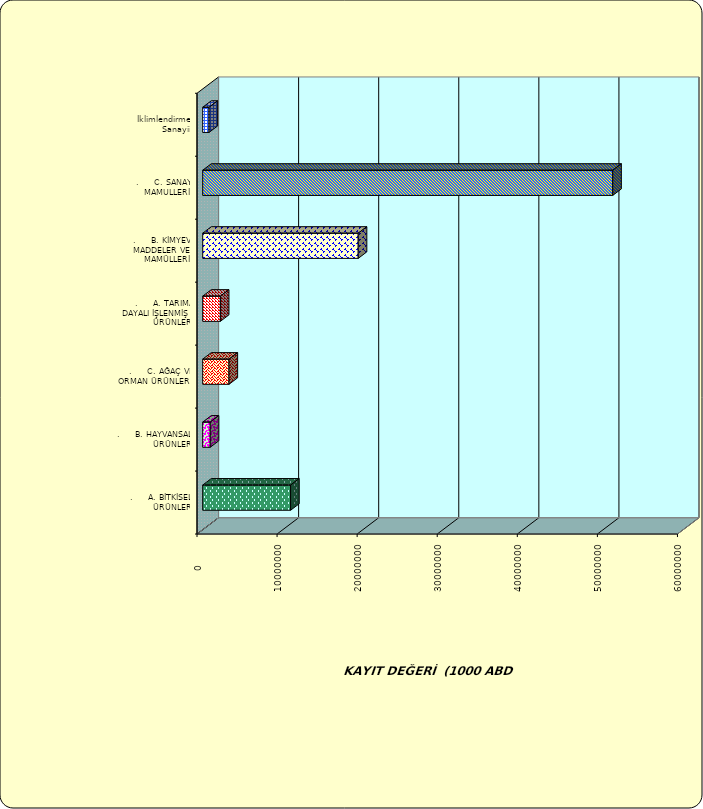
| Category | Series 0 |
|---|---|
| .     A. BİTKİSEL ÜRÜNLER | 10976497.251 |
| .     B. HAYVANSAL ÜRÜNLER | 939091.806 |
| .     C. AĞAÇ VE ORMAN ÜRÜNLERİ | 3286708.735 |
| .     A. TARIMA DAYALI İŞLENMİŞ ÜRÜNLER | 2205523.006 |
| .     B. KİMYEVİ MADDELER VE MAMÜLLERİ | 19422402.354 |
| .     C. SANAYİ MAMULLERİ | 51207708.513 |
|  İklimlendirme Sanayii | 789719.546 |